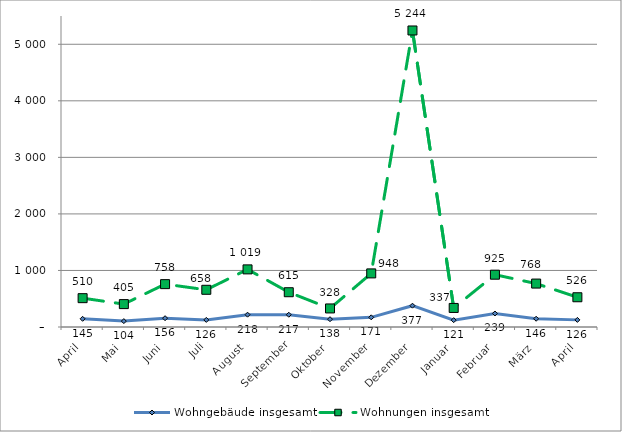
| Category | Wohngebäude insgesamt | Wohnungen insgesamt |
|---|---|---|
| April | 145 | 510 |
| Mai | 104 | 405 |
| Juni | 156 | 758 |
| Juli | 126 | 658 |
| August | 218 | 1019 |
| September | 217 | 615 |
| Oktober | 138 | 328 |
| November | 171 | 948 |
| Dezember | 377 | 5244 |
| Januar | 121 | 337 |
| Februar | 239 | 925 |
| März | 146 | 768 |
| April | 126 | 526 |